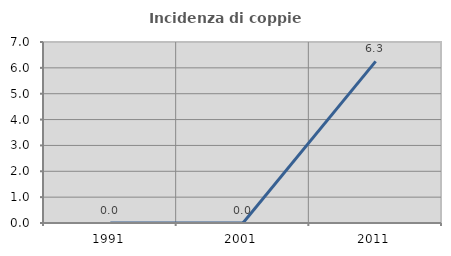
| Category | Incidenza di coppie miste |
|---|---|
| 1991.0 | 0 |
| 2001.0 | 0 |
| 2011.0 | 6.25 |